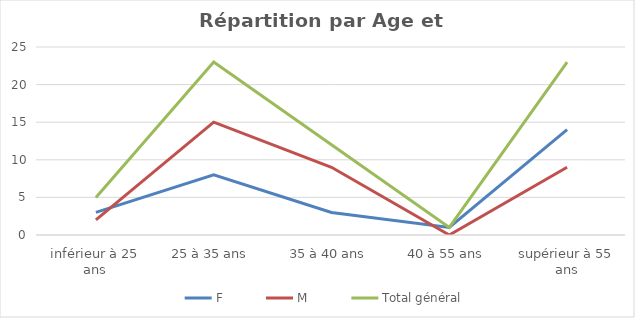
| Category | F | M | Total général |
|---|---|---|---|
| inférieur à 25 ans | 3 | 2 | 5 |
| 25 à 35 ans | 8 | 15 | 23 |
| 35 à 40 ans | 3 | 9 | 12 |
| 40 à 55 ans | 1 | 0 | 1 |
| supérieur à 55 ans | 14 | 9 | 23 |